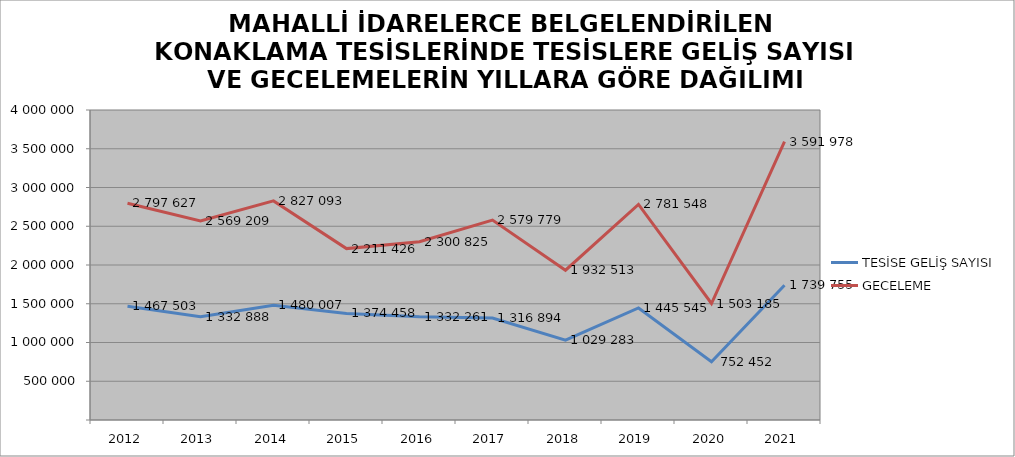
| Category | TESİSE GELİŞ SAYISI | GECELEME |
|---|---|---|
| 2012 | 1467503 | 2797627 |
| 2013 | 1332888 | 2569209 |
| 2014 | 1480007 | 2827093 |
| 2015 | 1374458 | 2211426 |
| 2016 | 1332261 | 2300825 |
| 2017 | 1316894 | 2579779 |
| 2018 | 1029283 | 1932513 |
| 2019 | 1445545 | 2781548 |
| 2020 | 752452 | 1503185 |
| 2021 | 1739755 | 3591978 |